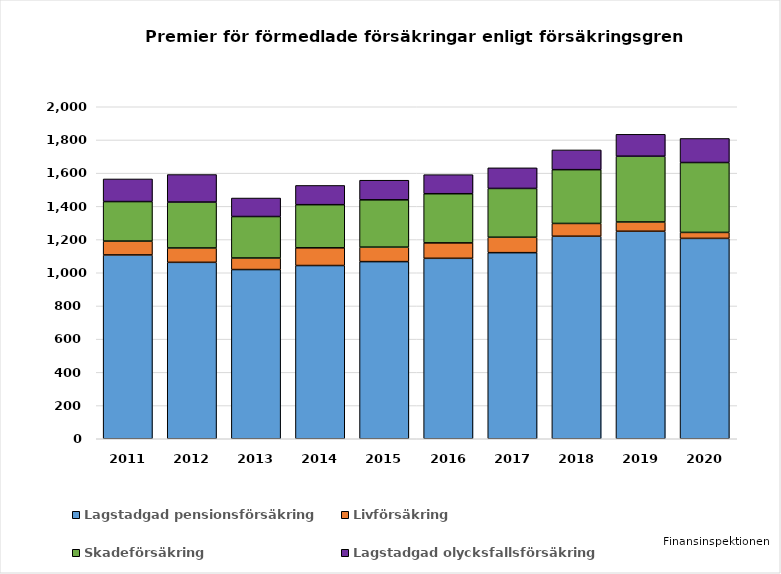
| Category | Lagstadgad pensionsförsäkring | Livförsäkring | Skadeförsäkring | Lagstadgad olycksfallsförsäkring |
|---|---|---|---|---|
| 2011.0 | 1107.329 | 83.403 | 238.041 | 136.289 |
| 2012.0 | 1062.705 | 86.597 | 276.62 | 165.706 |
| 2013.0 | 1019.216 | 69.648 | 249.823 | 111.515 |
| 2014.0 | 1043.573 | 106.619 | 259.835 | 115.957 |
| 2015.0 | 1067.062 | 87.285 | 284.943 | 118.153 |
| 2016.0 | 1087 | 93 | 296 | 115 |
| 2017.0 | 1121 | 93 | 294 | 124 |
| 2018.0 | 1220 | 77 | 324 | 119 |
| 2019.0 | 1250 | 56 | 396 | 132 |
| 2020.0 | 1207 | 36 | 421 | 145 |